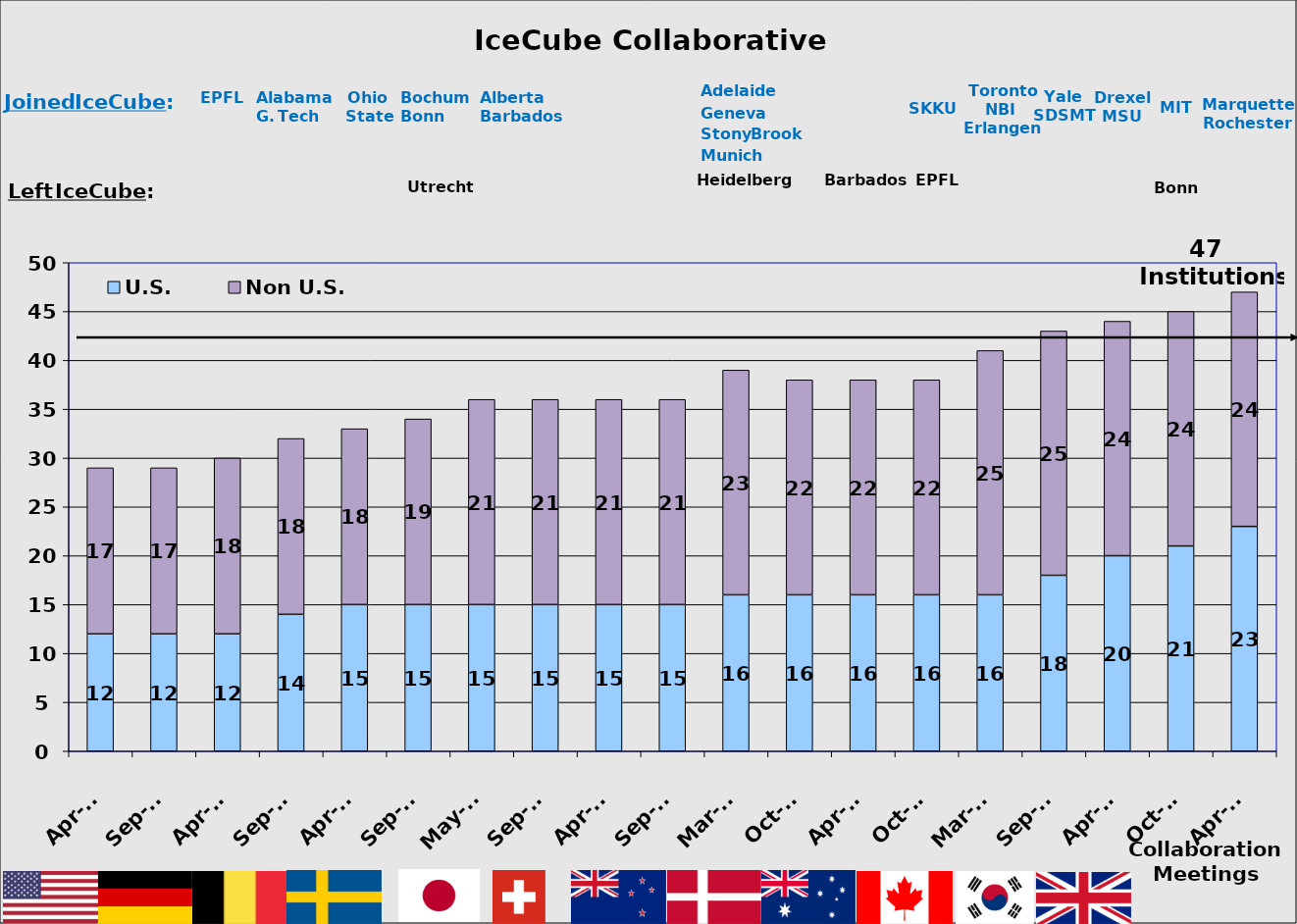
| Category | U.S. | Non U.S. |
|---|---|---|
| Apr-07 | 12 | 17 |
| Sep-07 | 12 | 17 |
| Apr-08 | 12 | 18 |
| Sep-08 | 14 | 18 |
| Apr-09 | 15 | 18 |
| Sep-09 | 15 | 19 |
| May-10 | 15 | 21 |
| Sep-10 | 15 | 21 |
| Apr-11 | 15 | 21 |
| Sep-11 | 15 | 21 |
| Mar-12 | 16 | 23 |
| Oct-12 | 16 | 22 |
| Apr-13 | 16 | 22 |
| Oct-13 | 16 | 22 |
| Mar-14 | 16 | 25 |
| Sep-14 | 18 | 25 |
| Apr-15 | 20 | 24 |
| Oct-15 | 21 | 24 |
| Apr-15 | 23 | 24 |